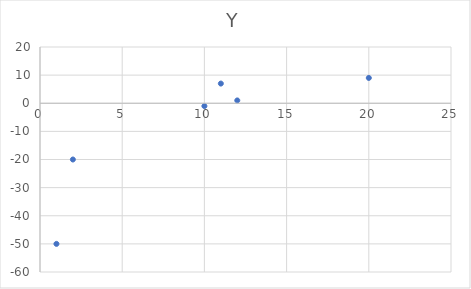
| Category | Y |
|---|---|
| 1.0 | -50 |
| 2.0 | -20 |
| 10.0 | -1 |
| 12.0 | 1 |
| 11.0 | 7 |
| 20.0 | 9 |